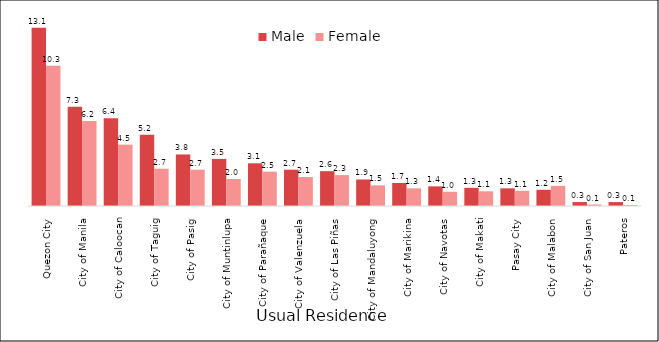
| Category | Male | Female |
|---|---|---|
|  Quezon City | 13.058 | 10.288 |
|  City of Manila | 7.266 | 6.223 |
|  City of Caloocan | 6.439 | 4.496 |
|  City of Taguig | 5.216 | 2.734 |
|  City of Pasig | 3.777 | 2.662 |
|  City of Muntinlupa | 3.453 | 1.978 |
|  City of Parañaque | 3.129 | 2.518 |
|  City of Valenzuela | 2.662 | 2.122 |
|  City of Las Piñas | 2.554 | 2.266 |
|  City of Mandaluyong | 1.942 | 1.511 |
|  City of Marikina | 1.691 | 1.295 |
|  City of Navotas | 1.439 | 1.043 |
|  City of Makati | 1.331 | 1.079 |
|  Pasay City | 1.295 | 1.115 |
|  City of Malabon | 1.187 | 1.475 |
|  City of San Juan | 0.288 | 0.108 |
|  Pateros | 0.288 | 0.072 |